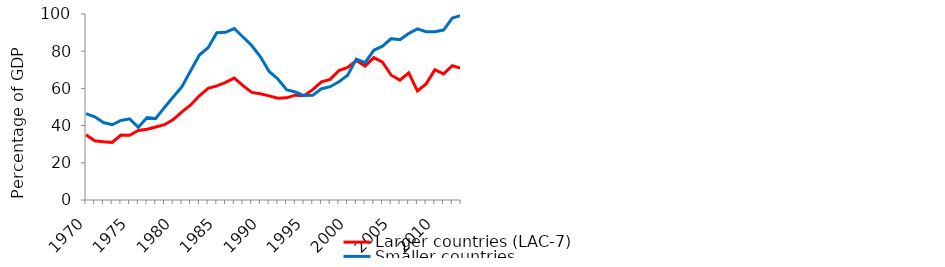
| Category | Larger countries (LAC-7) | Smaller countries |
|---|---|---|
| 1970.0 | 35.057 | 46.422 |
| 1971.0 | 31.798 | 44.728 |
| 1972.0 | 31.277 | 41.671 |
| 1973.0 | 30.985 | 40.464 |
| 1974.0 | 34.945 | 42.781 |
| 1975.0 | 34.813 | 43.609 |
| 1976.0 | 37.424 | 39.051 |
| 1977.0 | 38.054 | 44.318 |
| 1978.0 | 39.256 | 43.863 |
| 1979.0 | 40.478 | 49.772 |
| 1980.0 | 43.204 | 55.392 |
| 1981.0 | 47.356 | 60.932 |
| 1982.0 | 51.082 | 69.472 |
| 1983.0 | 56.038 | 77.934 |
| 1984.0 | 60.08 | 81.841 |
| 1985.0 | 61.319 | 89.883 |
| 1986.0 | 63.261 | 90.137 |
| 1987.0 | 65.533 | 92.188 |
| 1988.0 | 61.447 | 87.642 |
| 1989.0 | 57.866 | 83.083 |
| 1990.0 | 57.124 | 77.016 |
| 1991.0 | 55.979 | 69.118 |
| 1992.0 | 54.767 | 65.06 |
| 1993.0 | 54.938 | 59.321 |
| 1994.0 | 56.351 | 58.049 |
| 1995.0 | 56.088 | 56.148 |
| 1996.0 | 59.342 | 56.267 |
| 1997.0 | 63.564 | 59.811 |
| 1998.0 | 64.834 | 60.921 |
| 1999.0 | 69.619 | 63.518 |
| 2000.0 | 71.224 | 67.126 |
| 2001.0 | 74.952 | 75.756 |
| 2002.0 | 72.007 | 73.887 |
| 2003.0 | 76.545 | 80.5 |
| 2004.0 | 74.092 | 82.686 |
| 2005.0 | 67.082 | 86.753 |
| 2006.0 | 64.452 | 86.128 |
| 2007.0 | 68.365 | 89.508 |
| 2008.0 | 58.601 | 91.974 |
| 2009.0 | 62.38 | 90.52 |
| 2010.0 | 70.092 | 90.483 |
| 2011.0 | 67.803 | 91.347 |
| 2012.0 | 72.185 | 97.844 |
| 2013.0 | 70.836 | 99.179 |